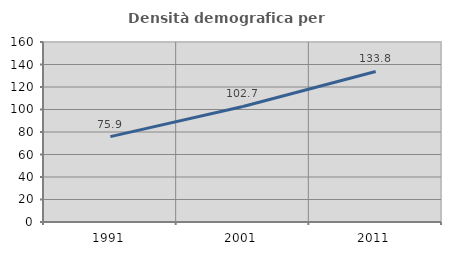
| Category | Densità demografica |
|---|---|
| 1991.0 | 75.89 |
| 2001.0 | 102.67 |
| 2011.0 | 133.817 |